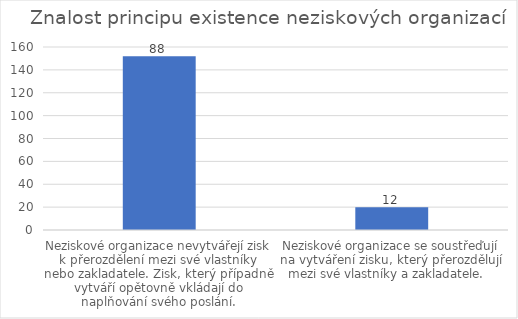
| Category | Series 0 |
|---|---|
| Neziskové organizace nevytvářejí zisk k přerozdělení mezi své vlastníky nebo zakladatele. Zisk, který případně vytváří opětovně vkládají do naplňování svého poslání. | 152 |
| Neziskové organizace se soustřeďují na vytváření zisku, který přerozdělují mezi své vlastníky a zakladatele.   | 20 |